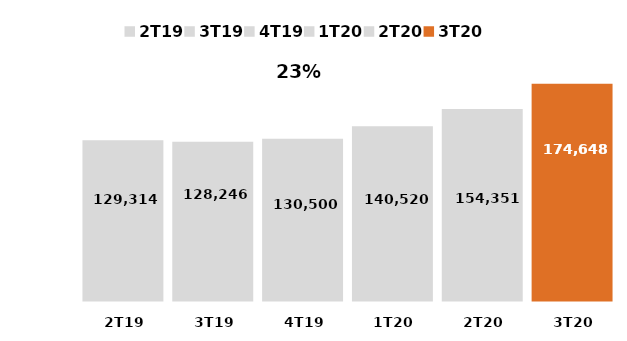
| Category | Ticket médio MCMV (em R$) |
|---|---|
| 2T19 | 129313.675 |
| 3T19 | 128246.144 |
| 4T19 | 130500.397 |
| 1T20 | 140520.207 |
| 2T20 | 154350.881 |
| 3T20 | 174648.464 |